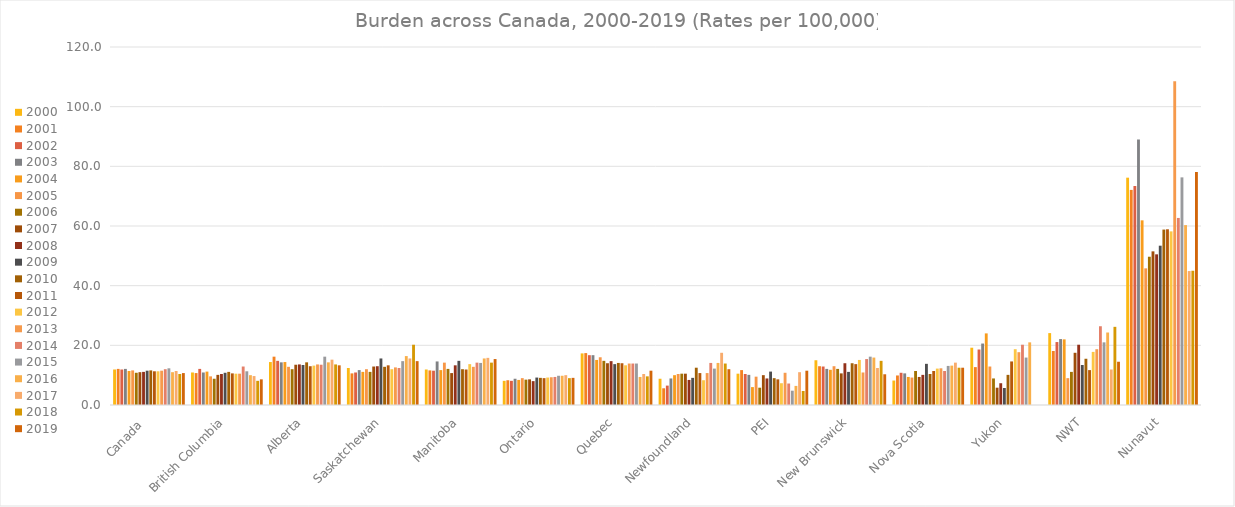
| Category | 2000 | 2001 | 2002 | 2003 | 2004 | 2005 | 2006 | 2007 | 2008 | 2009 | 2010 | 2011 | 2012 | 2013 | 2014 | 2015 | 2016 | 2017 | 2018 | 2019 |
|---|---|---|---|---|---|---|---|---|---|---|---|---|---|---|---|---|---|---|---|---|
| Canada  | 11.9 | 12.1 | 11.9 | 12.1 | 11.4 | 11.6 | 10.8 | 11 | 11.1 | 11.5 | 11.6 | 11.3 | 11.3 | 11.5 | 12 | 12.3 | 11 | 11.4 | 10.4 | 10.7 |
| British Columbia | 10.9 | 10.7 | 12.1 | 10.9 | 11.2 | 9.6 | 8.8 | 10.1 | 10.4 | 10.8 | 11.1 | 10.6 | 10.5 | 10.5 | 12.9 | 11.3 | 10 | 9.7 | 8.1 | 8.6 |
| Alberta | 14.4 | 16.2 | 14.8 | 14.3 | 14.4 | 12.8 | 12 | 13.5 | 13.6 | 13.4 | 14.3 | 13 | 13.2 | 13.6 | 13.5 | 16.2 | 14.3 | 15.2 | 13.6 | 13.3 |
| Saskatchewan | 12.4 | 10.6 | 10.9 | 11.7 | 11.1 | 12 | 11.1 | 12.9 | 13 | 15.6 | 12.8 | 13.3 | 12 | 12.6 | 12.4 | 14.7 | 16.4 | 15.6 | 20.2 | 14.7 |
| Manitoba | 11.9 | 11.6 | 11.5 | 14.6 | 11.7 | 14.2 | 12.1 | 10.7 | 13.3 | 14.8 | 12 | 11.9 | 13.7 | 12.8 | 14.2 | 14.1 | 15.6 | 15.8 | 14.2 | 15.4 |
| Ontario | 8.1 | 8.3 | 8.1 | 8.8 | 8.4 | 9 | 8.5 | 8.6 | 8 | 9.2 | 9.1 | 9 | 9.2 | 9.3 | 9.4 | 9.8 | 9.8 | 10 | 9 | 9.1 |
| Quebec | 17.3 | 17.4 | 16.7 | 16.7 | 15.1 | 16 | 14.8 | 14 | 14.7 | 13.7 | 14.1 | 14 | 13.3 | 13.9 | 13.9 | 13.9 | 9.4 | 10.4 | 9.6 | 11.5 |
| Newfoundland | 8.8 | 5.6 | 6.5 | 8.9 | 10 | 10.4 | 10.5 | 10.5 | 8.4 | 9.1 | 12.5 | 10.7 | 8.3 | 10.7 | 14.1 | 12.2 | 14.1 | 17.5 | 13.9 | 12 |
| PEI | 10.5 | 11.7 | 10.4 | 10.1 | 6 | 9.5 | 5.8 | 10 | 8.9 | 11.2 | 9 | 8.6 | 7.3 | 10.8 | 7.2 | 4.8 | 6.4 | 11 | 4.7 | 11.5 |
| New Brunswick | 15 | 13 | 12.9 | 12.1 | 11.8 | 13 | 12.1 | 10.6 | 14 | 11.1 | 14 | 13.7 | 15.1 | 10.9 | 15.4 | 16.2 | 15.9 | 12.4 | 14.8 | 10.3 |
| Nova Scotia | 8.2 | 9.9 | 10.8 | 10.6 | 9.4 | 9.2 | 11.4 | 9.4 | 10.1 | 13.8 | 10.4 | 11.4 | 12.2 | 12.3 | 11.4 | 13.1 | 13.2 | 14.2 | 12.5 | 12.5 |
| Yukon | 19.2 | 12.7 | 18.6 | 20.6 | 24 | 12.9 | 8.9 | 5.8 | 7.3 | 5.7 | 10.1 | 14.6 | 18.7 | 17.7 | 20.2 | 15.9 | 21 | 0 | 0 | 0 |
| NWT | 24.1 | 18.1 | 21.1 | 22.1 | 22 | 9 | 11.1 | 17.5 | 20.2 | 13.4 | 15.5 | 11.7 | 17.8 | 18.7 | 26.4 | 21 | 24.3 | 11.9 | 26.2 | 14.5 |
| Nunavut | 76.2 | 72.1 | 73.4 | 89 | 61.9 | 45.8 | 49.7 | 51.5 | 50.5 | 53.4 | 58.8 | 58.9 | 58.2 | 108.5 | 62.7 | 76.3 | 60.3 | 44.9 | 45 | 78.1 |